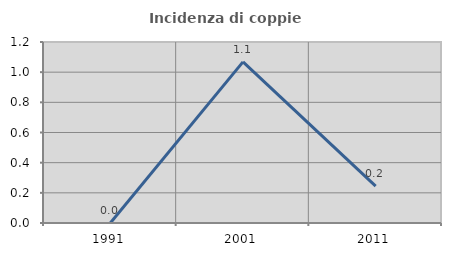
| Category | Incidenza di coppie miste |
|---|---|
| 1991.0 | 0 |
| 2001.0 | 1.068 |
| 2011.0 | 0.245 |